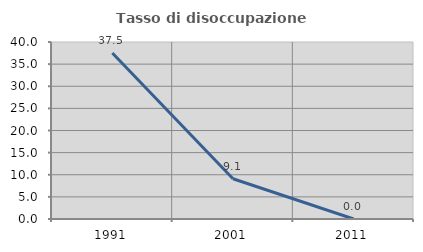
| Category | Tasso di disoccupazione giovanile  |
|---|---|
| 1991.0 | 37.5 |
| 2001.0 | 9.091 |
| 2011.0 | 0 |